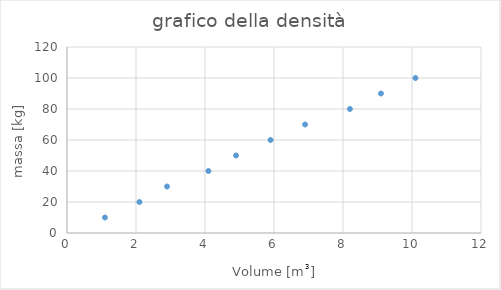
| Category | massa [kg] |
|---|---|
| 1.1 | 10 |
| 2.1 | 20 |
| 2.9 | 30 |
| 4.1 | 40 |
| 4.9 | 50 |
| 5.9 | 60 |
| 6.9 | 70 |
| 8.2 | 80 |
| 9.1 | 90 |
| 10.1 | 100 |